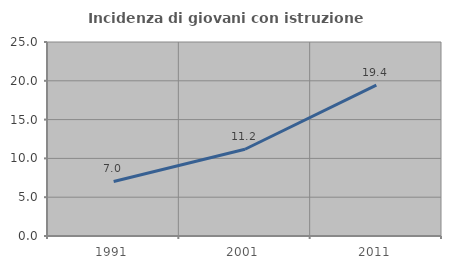
| Category | Incidenza di giovani con istruzione universitaria |
|---|---|
| 1991.0 | 7.03 |
| 2001.0 | 11.176 |
| 2011.0 | 19.449 |